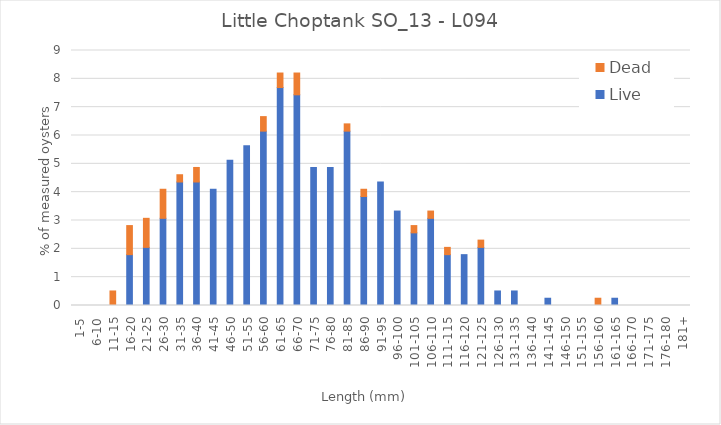
| Category | Live | Dead |
|---|---|---|
| 1-5 | 0 | 0 |
| 6-10 | 0 | 0 |
| 11-15 | 0 | 0.513 |
| 16-20 | 1.795 | 1.026 |
| 21-25 | 2.051 | 1.026 |
| 26-30 | 3.077 | 1.026 |
| 31-35 | 4.359 | 0.256 |
| 36-40 | 4.359 | 0.513 |
| 41-45 | 4.103 | 0 |
| 46-50 | 5.128 | 0 |
| 51-55 | 5.641 | 0 |
| 56-60 | 6.154 | 0.513 |
| 61-65 | 7.692 | 0.513 |
| 66-70 | 7.436 | 0.769 |
| 71-75 | 4.872 | 0 |
| 76-80 | 4.872 | 0 |
| 81-85 | 6.154 | 0.256 |
| 86-90 | 3.846 | 0.256 |
| 91-95 | 4.359 | 0 |
| 96-100 | 3.333 | 0 |
| 101-105 | 2.564 | 0.256 |
| 106-110 | 3.077 | 0.256 |
| 111-115 | 1.795 | 0.256 |
| 116-120 | 1.795 | 0 |
| 121-125 | 2.051 | 0.256 |
| 126-130 | 0.513 | 0 |
| 131-135 | 0.513 | 0 |
| 136-140 | 0 | 0 |
| 141-145 | 0.256 | 0 |
| 146-150 | 0 | 0 |
| 151-155 | 0 | 0 |
| 156-160 | 0 | 0.256 |
| 161-165 | 0.256 | 0 |
| 166-170 | 0 | 0 |
| 171-175 | 0 | 0 |
| 176-180 | 0 | 0 |
| 181+ | 0 | 0 |